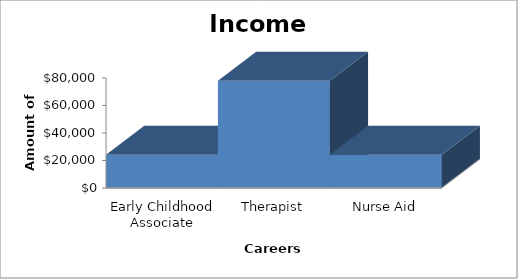
| Category | Series 0 |
|---|---|
| Early Childhood Associate | 23870 |
| Therapist | 77630 |
| Nurse Aid | 23837 |